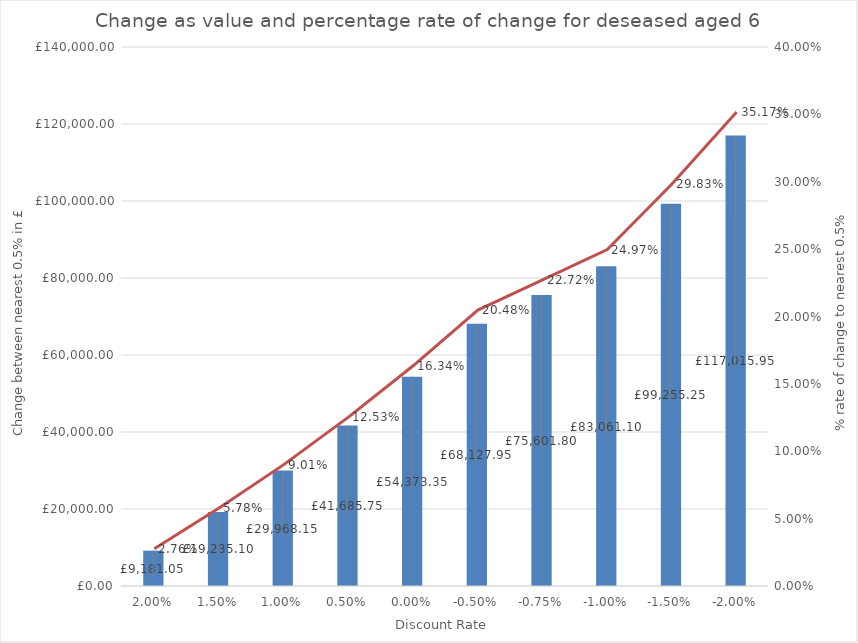
| Category | Value change |
|---|---|
| 0.02 | 9181.05 |
| 0.015 | 19235.1 |
| 0.01 | 29968.15 |
| 0.005 | 41685.75 |
| 0.0 | 54373.35 |
| -0.005 | 68127.95 |
| -0.0075 | 75601.8 |
| -0.01 | 83061.1 |
| -0.015 | 99255.25 |
| -0.02 | 117015.95 |